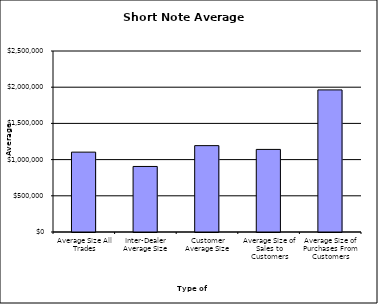
| Category | Security Type |
|---|---|
| Average Size All Trades | 1103114.229 |
| Inter-Dealer Average Size | 905283.401 |
| Customer Average Size | 1192886.201 |
| Average Size of Sales to Customers | 1140769.198 |
| Average Size of Purchases From Customers | 1962710.843 |